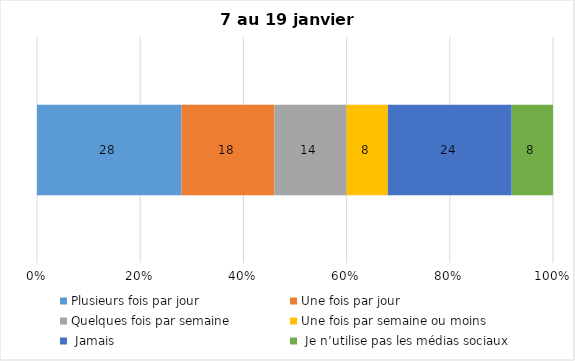
| Category | Plusieurs fois par jour | Une fois par jour | Quelques fois par semaine   | Une fois par semaine ou moins   |  Jamais   |  Je n’utilise pas les médias sociaux |
|---|---|---|---|---|---|---|
| 0 | 28 | 18 | 14 | 8 | 24 | 8 |